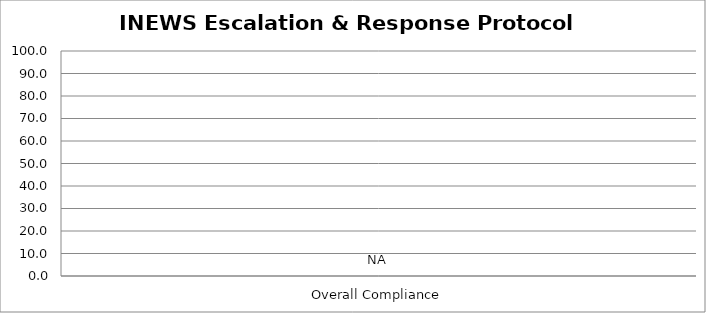
| Category | Series 0 |
|---|---|
| Overall Compliance | 0 |